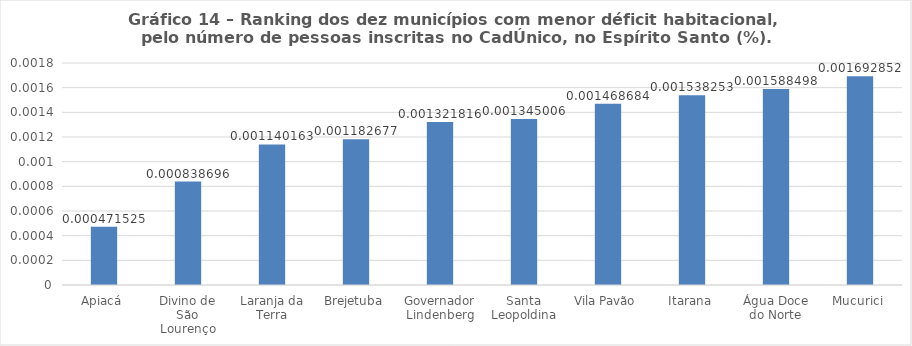
| Category | Series 0 |
|---|---|
| Apiacá | 0 |
| Divino de São Lourenço | 0.001 |
| Laranja da Terra | 0.001 |
| Brejetuba | 0.001 |
| Governador Lindenberg | 0.001 |
| Santa Leopoldina | 0.001 |
| Vila Pavão | 0.001 |
| Itarana | 0.002 |
| Água Doce do Norte | 0.002 |
| Mucurici | 0.002 |